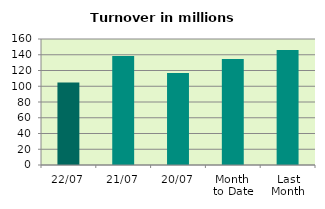
| Category | Series 0 |
|---|---|
| 22/07 | 104.661 |
| 21/07 | 138.271 |
| 20/07 | 116.946 |
| Month 
to Date | 134.665 |
| Last
Month | 145.879 |